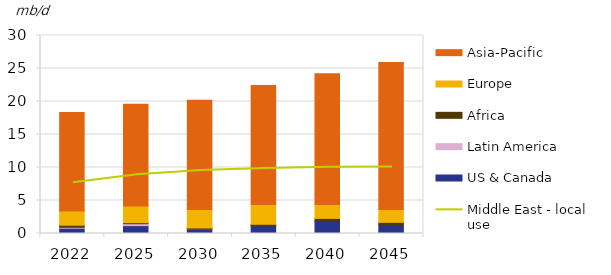
| Category | US & Canada | Latin America | Africa | Europe | Asia-Pacific |
|---|---|---|---|---|---|
| 2022.0 | 0.8 | 0.14 | 0.31 | 2.17 | 14.898 |
| 2025.0 | 1.19 | 0.296 | 0.148 | 2.539 | 15.427 |
| 2030.0 | 0.635 | 0.005 | 0.197 | 2.791 | 16.571 |
| 2035.0 | 1.168 | -0.004 | 0.228 | 2.996 | 18.029 |
| 2040.0 | 1.823 | -0.002 | 0.466 | 2.09 | 19.815 |
| 2045.0 | 1.315 | -0.002 | 0.372 | 1.945 | 22.278 |